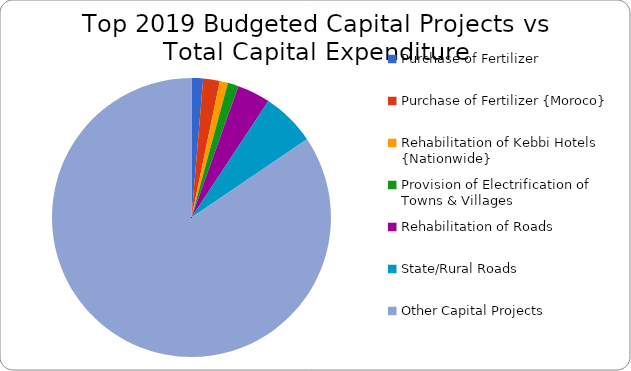
| Category | Series 0 |
|---|---|
| Purchase of Fertilizer | 1400000000 |
| Purchase of Fertilizer {Moroco} | 2000000000 |
| Rehabilitation of Kebbi Hotels {Nationwide} | 1000000000 |
| Provision of Electrification of Towns & Villages | 1300000000 |
| Rehabilitation of Roads | 4000000000 |
| State/Rural Roads | 6500000000 |
| Other Capital Projects | 88185049818 |